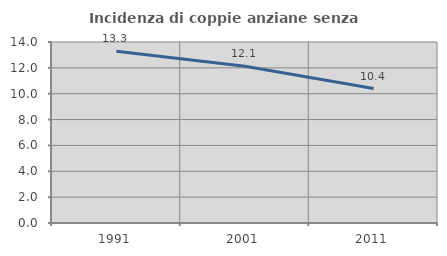
| Category | Incidenza di coppie anziane senza figli  |
|---|---|
| 1991.0 | 13.293 |
| 2001.0 | 12.121 |
| 2011.0 | 10.4 |